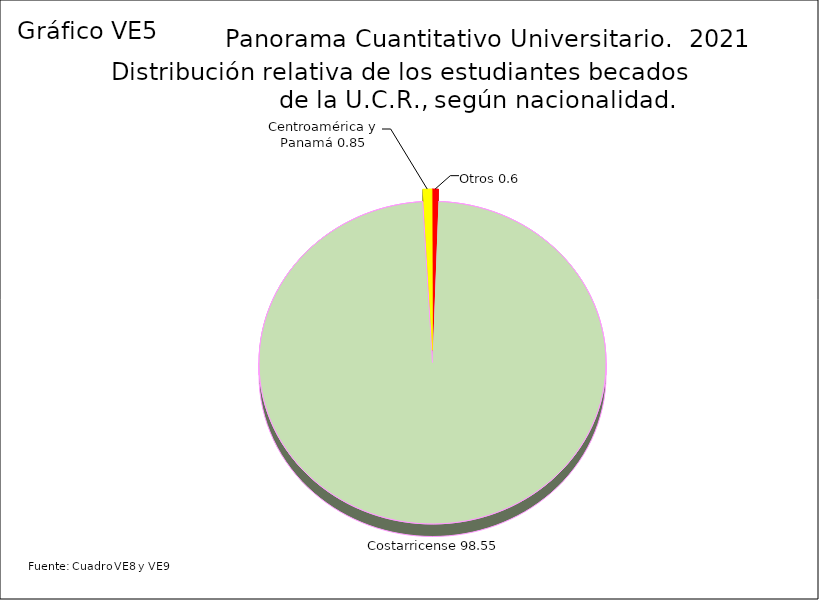
| Category | Series 3 |
|---|---|
| Costarricense | 98.55 |
| Centroamérica y Panamá | 0.85 |
| Otros | 0.6 |